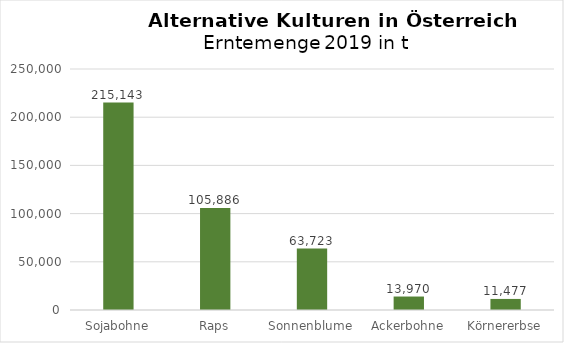
| Category | Erntemenge in t |
|---|---|
| Sojabohne | 215143 |
| Raps | 105886 |
| Sonnenblume | 63723 |
| Ackerbohne | 13970 |
| Körnererbse | 11477 |